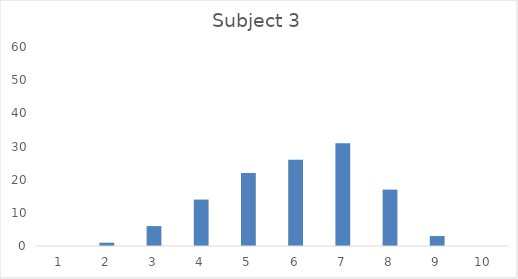
| Category | Series 0 |
|---|---|
| 0 | 0 |
| 1 | 1 |
| 2 | 6 |
| 3 | 14 |
| 4 | 22 |
| 5 | 26 |
| 6 | 31 |
| 7 | 17 |
| 8 | 3 |
| 9 | 0 |